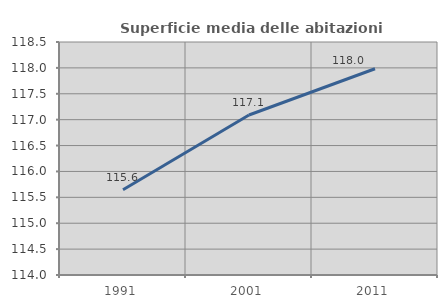
| Category | Superficie media delle abitazioni occupate |
|---|---|
| 1991.0 | 115.648 |
| 2001.0 | 117.09 |
| 2011.0 | 117.984 |